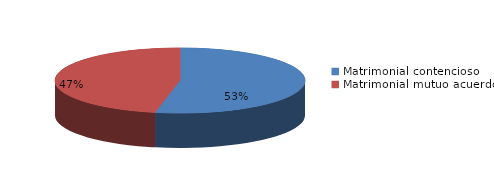
| Category | Series 0 |
|---|---|
| 0 | 1026 |
| 1 | 904 |